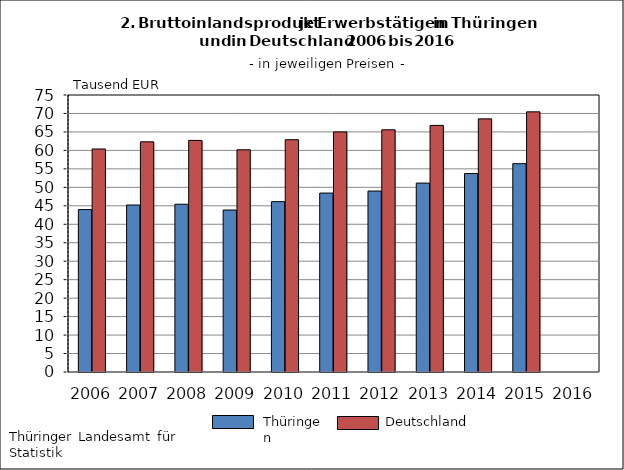
| Category | Series 0 | Series 1 |
|---|---|---|
| 2006.0 | 43.979 | 60.382 |
| 2007.0 | 45.212 | 62.324 |
| 2008.0 | 45.422 | 62.702 |
| 2009.0 | 43.857 | 60.165 |
| 2010.0 | 46.124 | 62.898 |
| 2011.0 | 48.445 | 65.015 |
| 2012.0 | 48.993 | 65.578 |
| 2013.0 | 51.152 | 66.77 |
| 2014.0 | 53.729 | 68.537 |
| 2015.0 | 56.403 | 70.437 |
| 2016.0 | 0 | 0 |